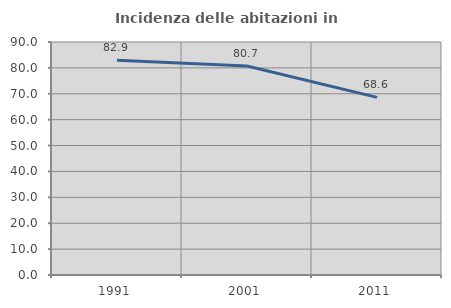
| Category | Incidenza delle abitazioni in proprietà  |
|---|---|
| 1991.0 | 82.913 |
| 2001.0 | 80.749 |
| 2011.0 | 68.625 |